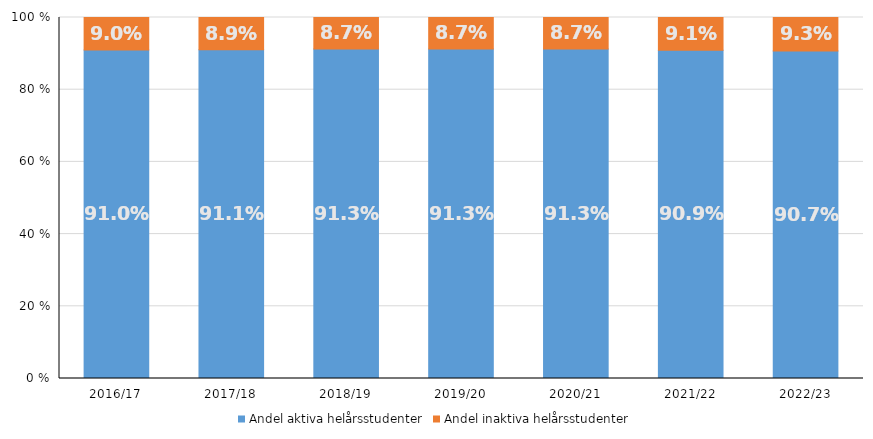
| Category | Andel aktiva helårsstudenter | Andel inaktiva helårsstudenter |
|---|---|---|
| 2016/17 | 0.91 | 0.09 |
| 2017/18 | 0.911 | 0.089 |
| 2018/19 | 0.913 | 0.087 |
| 2019/20 | 0.913 | 0.087 |
| 2020/21 | 0.913 | 0.087 |
| 2021/22 | 0.909 | 0.091 |
| 2022/23 | 0.907 | 0.093 |